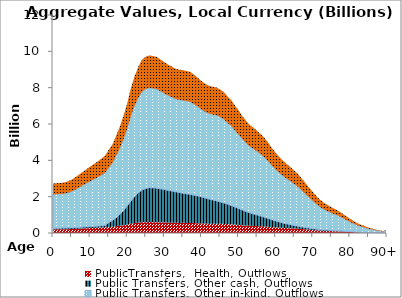
| Category | PublicTransfers,  Health, Outflows | Public Transfers, Other cash, Outflows | Public Transfers, Other in-kind, Outflows | Public Transfers, Education, Outflows |
|---|---|---|---|---|
| 0 | 202.572 | 62.185 | 1856.599 | 602.727 |
|  | 203.992 | 62.621 | 1869.612 | 606.952 |
| 2 | 204.907 | 62.901 | 1877.999 | 609.674 |
| 3 | 206.959 | 63.531 | 1896.81 | 615.781 |
| 4 | 211.253 | 64.85 | 1936.163 | 628.557 |
| 5 | 218.351 | 67.028 | 2001.216 | 649.676 |
| 6 | 228.061 | 70.009 | 2090.209 | 678.566 |
| 7 | 238.786 | 73.302 | 2188.51 | 710.479 |
| 8 | 249.813 | 76.687 | 2289.577 | 743.289 |
| 9 | 260.868 | 80.08 | 2390.892 | 776.18 |
| 10 | 271.893 | 83.465 | 2491.936 | 808.983 |
| 11 | 281.931 | 86.546 | 2583.94 | 838.851 |
| 12 | 292.53 | 89.8 | 2681.077 | 870.386 |
| 13 | 304.098 | 93.351 | 2787.102 | 904.806 |
| 14 | 316.375 | 97.12 | 2899.628 | 941.336 |
| 15 | 329.229 | 248.437 | 3017.435 | 979.581 |
| 16 | 344.899 | 339.935 | 3161.052 | 1026.205 |
| 17 | 371.494 | 464.62 | 3404.799 | 1105.335 |
| 18 | 397.871 | 621.57 | 3646.543 | 1183.815 |
| 19 | 429.432 | 810.853 | 3935.811 | 1277.723 |
| 20 | 465.486 | 1022.011 | 4266.249 | 1384.997 |
| 21 | 512.512 | 1248.027 | 4697.245 | 1524.915 |
| 22 | 545.522 | 1464.682 | 4999.789 | 1623.134 |
| 23 | 571.564 | 1645.205 | 5238.467 | 1700.618 |
| 24 | 590.823 | 1778.33 | 5414.977 | 1757.92 |
| 25 | 597.528 | 1858.133 | 5476.437 | 1777.873 |
| 26 | 599.798 | 1894.041 | 5497.238 | 1784.625 |
| 27 | 597.297 | 1889.698 | 5474.311 | 1777.183 |
| 28 | 595.359 | 1871.879 | 5456.557 | 1771.419 |
| 29 | 585.977 | 1845.124 | 5370.566 | 1743.503 |
| 30 | 578.13 | 1814.657 | 5298.651 | 1720.156 |
| 31 | 569.724 | 1780.36 | 5221.606 | 1695.144 |
| 32 | 564.207 | 1747.607 | 5171.038 | 1678.728 |
| 33 | 558.127 | 1714.256 | 5115.315 | 1660.638 |
| 34 | 556.713 | 1672.633 | 5102.358 | 1656.431 |
| 35 | 557.804 | 1633.618 | 5112.358 | 1659.678 |
| 36 | 557.007 | 1600.943 | 5105.049 | 1657.305 |
| 37 | 555.326 | 1571.804 | 5089.646 | 1652.305 |
| 38 | 546.503 | 1535.287 | 5008.783 | 1626.053 |
| 39 | 536.249 | 1502.141 | 4914.806 | 1595.545 |
| 40 | 525.585 | 1462.541 | 4817.066 | 1563.814 |
| 41 | 517.905 | 1411.195 | 4746.678 | 1540.963 |
| 42 | 513.65 | 1358.266 | 4707.68 | 1528.303 |
| 43 | 513.318 | 1308.201 | 4704.637 | 1527.315 |
| 44 | 514.175 | 1258.173 | 4712.489 | 1529.864 |
| 45 | 509.598 | 1206.225 | 4670.545 | 1516.247 |
| 46 | 503.011 | 1155.888 | 4610.168 | 1496.647 |
| 47 | 488.959 | 1101.105 | 4481.386 | 1454.839 |
| 48 | 478.427 | 1039.756 | 4384.856 | 1423.501 |
| 49 | 460.865 | 971.724 | 4223.898 | 1371.248 |
| 50 | 445.033 | 905.201 | 4078.796 | 1324.142 |
| 51 | 426.27 | 841.957 | 3906.825 | 1268.313 |
| 52 | 411.621 | 774.392 | 3772.569 | 1224.728 |
| 53 | 398.419 | 716.284 | 3651.566 | 1185.446 |
| 54 | 390.812 | 663.722 | 3581.85 | 1162.813 |
| 55 | 381.281 | 612.979 | 3494.501 | 1134.456 |
| 56 | 371.733 | 555.563 | 3406.989 | 1106.046 |
| 57 | 359.544 | 505.613 | 3295.277 | 1069.78 |
| 58 | 343.614 | 454.715 | 3149.271 | 1022.381 |
| 59 | 325.116 | 405.249 | 2979.735 | 967.342 |
| 60 | 309.112 | 355.198 | 2833.054 | 919.724 |
| 61 | 294.348 | 311.136 | 2697.745 | 875.797 |
| 62 | 282.507 | 269.5 | 2589.215 | 840.564 |
| 63 | 271.232 | 231.328 | 2485.878 | 807.016 |
| 64 | 260.934 | 195.035 | 2391.503 | 776.378 |
| 65 | 249.054 | 164.767 | 2282.618 | 741.03 |
| 66 | 237.201 | 138.744 | 2173.985 | 705.763 |
| 67 | 219.799 | 116.341 | 2014.494 | 653.986 |
| 68 | 202.022 | 98.731 | 1851.558 | 601.09 |
| 69 | 183.794 | 85.883 | 1684.495 | 546.855 |
| 70 | 166.367 | 75.121 | 1524.776 | 495.004 |
| 71 | 149.256 | 66.307 | 1367.956 | 444.094 |
| 72 | 134.575 | 58.934 | 1233.399 | 400.411 |
| 73 | 122.791 | 52.037 | 1125.402 | 365.351 |
| 74 | 113.816 | 46.366 | 1043.137 | 338.644 |
| 75 | 105.201 | 41.63 | 964.18 | 313.012 |
| 76 | 97.547 | 37.273 | 894.036 | 290.24 |
| 77 | 89.154 | 33.045 | 817.111 | 265.267 |
| 78 | 79.322 | 28.948 | 726.994 | 236.012 |
| 79 | 68.459 | 24.581 | 627.44 | 203.692 |
| 80 | 58.448 | 20.246 | 535.687 | 173.906 |
| 81 | 48.978 | 16.458 | 448.889 | 145.727 |
| 82 | 40.596 | 13.244 | 372.069 | 120.788 |
| 83 | 33.748 | 10.868 | 309.304 | 100.413 |
| 84 | 28.104 | 9.034 | 257.575 | 83.619 |
| 85 | 22.814 | 7.464 | 209.093 | 67.88 |
| 86 | 17.951 | 5.971 | 164.523 | 53.411 |
| 87 | 13.825 | 4.64 | 126.709 | 41.135 |
| 88 | 10.483 | 3.471 | 96.082 | 31.192 |
| 89 | 7.814 | 2.534 | 71.615 | 23.249 |
| 90+ | 16.032 | 5.087 | 146.939 | 47.702 |